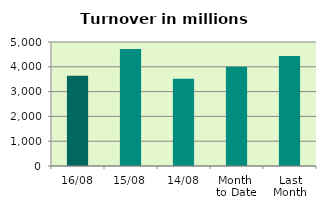
| Category | Series 0 |
|---|---|
| 16/08 | 3638.866 |
| 15/08 | 4722.418 |
| 14/08 | 3521.39 |
| Month 
to Date | 3998.107 |
| Last
Month | 4433.065 |